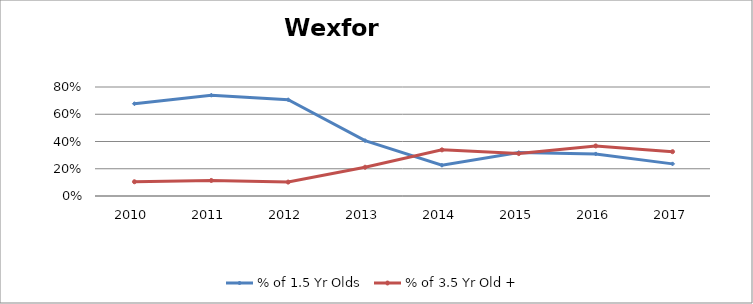
| Category | % of 1.5 Yr Olds | % of 3.5 Yr Old + |
|---|---|---|
| 2010.0 | 0.677 | 0.105 |
| 2011.0 | 0.74 | 0.114 |
| 2012.0 | 0.706 | 0.102 |
| 2013.0 | 0.406 | 0.211 |
| 2014.0 | 0.226 | 0.339 |
| 2015.0 | 0.319 | 0.311 |
| 2016.0 | 0.309 | 0.368 |
| 2017.0 | 0.236 | 0.325 |